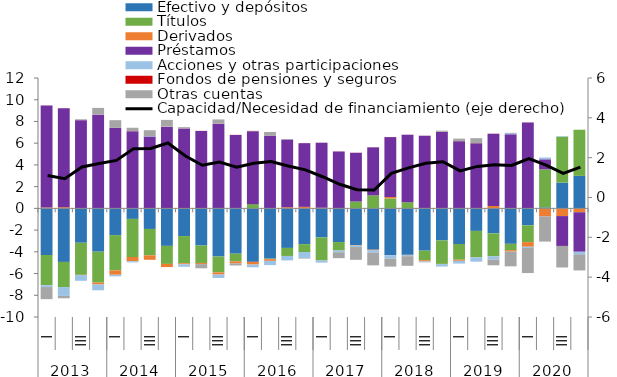
| Category | Efectivo y depósitos | Títulos | Derivados | Préstamos  | Acciones y otras participaciones  | Fondos de pensiones y seguros | Otras cuentas |
|---|---|---|---|---|---|---|---|
| 0 | -4.293 | -2.795 | 0.082 | 9.377 | -0.154 | 0.007 | -1.116 |
| 1 | -4.93 | -2.313 | 0.107 | 9.109 | -0.81 | 0.005 | -0.221 |
| 2 | -3.165 | -2.952 | -0.027 | 8.122 | -0.525 | 0.008 | 0.07 |
| 3 | -3.989 | -2.847 | -0.169 | 8.621 | -0.536 | 0.009 | 0.618 |
| 4 | -2.463 | -3.247 | -0.4 | 7.398 | -0.147 | 0.009 | 0.711 |
| 5 | -0.97 | -3.508 | -0.389 | 7.091 | -0.106 | 0.009 | 0.32 |
| 6 | -1.895 | -2.429 | -0.408 | 6.606 | 0.049 | 0.008 | 0.533 |
| 7 | -3.454 | -1.658 | -0.294 | 7.518 | 0.022 | 0.008 | 0.596 |
| 8 | -2.552 | -2.504 | -0.089 | 7.35 | -0.233 | 0.007 | 0.119 |
| 9 | -3.42 | -1.607 | -0.091 | 7.122 | -0.012 | 0.011 | -0.386 |
| 10 | -4.429 | -1.467 | -0.194 | 7.799 | -0.316 | 0.012 | 0.376 |
| 11 | -4.173 | -0.703 | -0.177 | 6.762 | -0.005 | 0.011 | -0.2 |
| 12 | -4.925 | 0.39 | -0.246 | 6.713 | -0.252 | 0.01 | 0.029 |
| 13 | -4.629 | -0.046 | -0.158 | 6.694 | -0.39 | 0.005 | 0.331 |
| 14 | -3.641 | -0.741 | 0.106 | 6.231 | -0.407 | 0.003 | 0.03 |
| 15 | -3.295 | -0.725 | 0.137 | 5.865 | -0.547 | 0.005 | -0.053 |
| 16 | -2.68 | -2.117 | 0.066 | 5.965 | -0.192 | 0.006 | -0.007 |
| 17 | -3.099 | -0.779 | 0.014 | 5.221 | -0.163 | 0.009 | -0.539 |
| 18 | -3.385 | 0.627 | -0.044 | 4.488 | -0.133 | 0.01 | -1.174 |
| 19 | -3.809 | 1.195 | -0.06 | 4.419 | -0.215 | 0.009 | -1.162 |
| 20 | -4.31 | 0.913 | 0.129 | 5.517 | -0.317 | 0.009 | -0.732 |
| 21 | -4.274 | 0.567 | -0.022 | 6.205 | -0.104 | 0.006 | -0.887 |
| 22 | -3.894 | -0.881 | -0.108 | 6.681 | -0.08 | 0.006 | -0.01 |
| 23 | -2.955 | -2.157 | -0.018 | 7.037 | -0.226 | 0.009 | 0.107 |
| 24 | -3.281 | -1.446 | -0.103 | 6.185 | -0.253 | 0.011 | 0.224 |
| 25 | -2.075 | -2.438 | 0.002 | 5.985 | -0.391 | 0.011 | 0.467 |
| 26 | -2.298 | -2.115 | 0.22 | 6.654 | -0.309 | 0.008 | -0.519 |
| 27 | -3.264 | -0.581 | -0.126 | 6.819 | 0.113 | 0.013 | -1.365 |
| 28 | -1.56 | -1.547 | -0.429 | 7.901 | -0.105 | 0.008 | -2.313 |
| 29 | 0.094 | 3.496 | -0.736 | 0.926 | 0.165 | -0.003 | -2.32 |
| 30 | 2.371 | 4.233 | -0.711 | -2.748 | 0.045 | -0.005 | -1.977 |
| 31 | 2.991 | 4.248 | -0.36 | -3.634 | -0.277 | -0.01 | -1.433 |